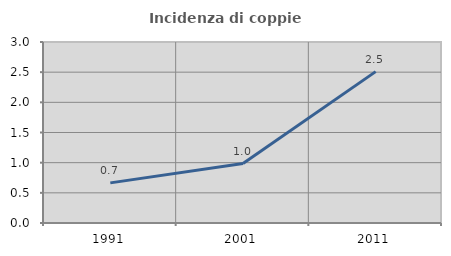
| Category | Incidenza di coppie miste |
|---|---|
| 1991.0 | 0.665 |
| 2001.0 | 0.986 |
| 2011.0 | 2.509 |